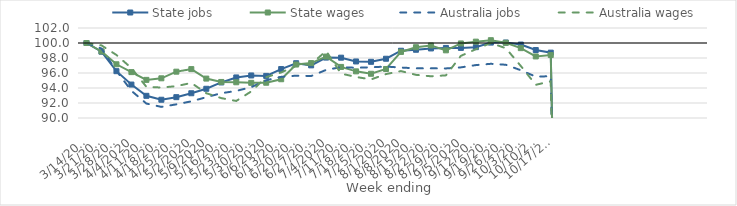
| Category | State jobs | State wages | Australia jobs | Australia wages |
|---|---|---|---|---|
| 14/03/2020 | 100 | 100 | 100 | 100 |
| 21/03/2020 | 98.841 | 98.884 | 99.265 | 99.682 |
| 28/03/2020 | 96.243 | 97.164 | 96.284 | 98.406 |
| 04/04/2020 | 94.459 | 96.118 | 93.626 | 96.656 |
| 11/04/2020 | 92.958 | 95.084 | 91.924 | 94.154 |
| 18/04/2020 | 92.434 | 95.292 | 91.482 | 94.062 |
| 25/04/2020 | 92.777 | 96.176 | 91.821 | 94.245 |
| 02/05/2020 | 93.299 | 96.519 | 92.221 | 94.677 |
| 09/05/2020 | 93.897 | 95.254 | 92.772 | 93.304 |
| 16/05/2020 | 94.74 | 94.807 | 93.305 | 92.652 |
| 23/05/2020 | 95.408 | 94.763 | 93.609 | 92.272 |
| 30/05/2020 | 95.673 | 94.688 | 94.11 | 93.544 |
| 06/06/2020 | 95.614 | 94.702 | 95.034 | 95.442 |
| 13/06/2020 | 96.525 | 95.168 | 95.487 | 96.076 |
| 20/06/2020 | 97.305 | 97.128 | 95.645 | 96.966 |
| 27/06/2020 | 97.018 | 97.322 | 95.594 | 97.186 |
| 04/07/2020 | 98.055 | 98.192 | 96.409 | 98.934 |
| 11/07/2020 | 98.044 | 96.811 | 96.784 | 95.92 |
| 18/07/2020 | 97.538 | 96.219 | 96.696 | 95.473 |
| 25/07/2020 | 97.492 | 95.897 | 96.767 | 95.143 |
| 01/08/2020 | 97.901 | 96.536 | 96.854 | 95.856 |
| 08/08/2020 | 98.968 | 98.81 | 96.728 | 96.257 |
| 15/08/2020 | 99.099 | 99.438 | 96.62 | 95.754 |
| 22/08/2020 | 99.274 | 99.677 | 96.624 | 95.563 |
| 29/08/2020 | 99.342 | 99.022 | 96.609 | 95.684 |
| 05/09/2020 | 99.347 | 99.94 | 96.751 | 98.286 |
| 12/09/2020 | 99.445 | 100.18 | 97.054 | 99.176 |
| 19/09/2020 | 100.052 | 100.373 | 97.226 | 99.992 |
| 26/09/2020 | 100.065 | 100.026 | 97.1 | 99.309 |
| 03/10/2020 | 99.792 | 99.314 | 96.368 | 96.936 |
| 10/10/2020 | 99.063 | 98.208 | 95.514 | 94.424 |
| 17/10/2020 | 98.714 | 98.392 | 95.573 | 94.889 |